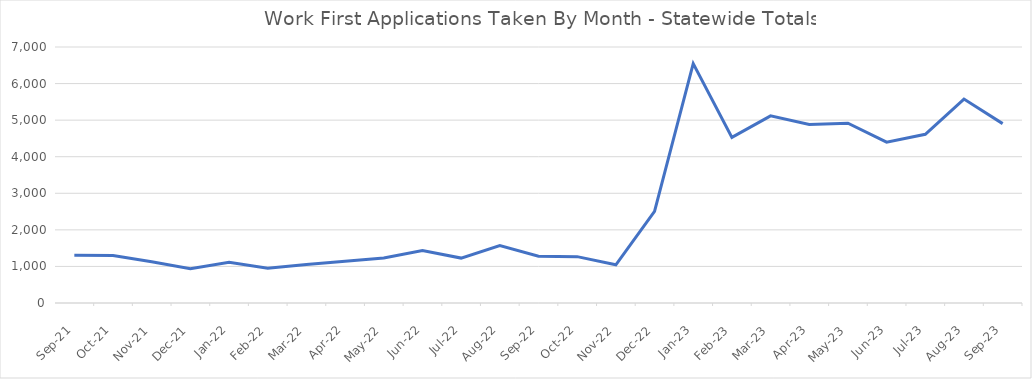
| Category | Series 0 |
|---|---|
| 2023-09-23 | 4905 |
| 2023-08-23 | 5577 |
| 2023-07-23 | 4613 |
| 2023-06-23 | 4398 |
| 2023-05-23 | 4918 |
| 2023-04-23 | 4882 |
| 2023-03-23 | 5117 |
| 2023-02-01 | 4530 |
| 2023-01-01 | 6546 |
| 2022-12-01 | 2505 |
| 2022-11-22 | 1044 |
| 2022-10-22 | 1268 |
| 2022-09-22 | 1279 |
| 2022-08-22 | 1568 |
| 2022-07-22 | 1228 |
| 2022-06-01 | 1433 |
| 2022-05-01 | 1230 |
| 2022-04-01 | 1142 |
| 2022-03-01 | 1056 |
| 2022-02-01 | 953 |
| 2022-01-01 | 1113 |
| 2021-12-02 | 940 |
| 2021-11-01 | 1127 |
| 2021-10-01 | 1301 |
| 2021-09-01 | 1308 |